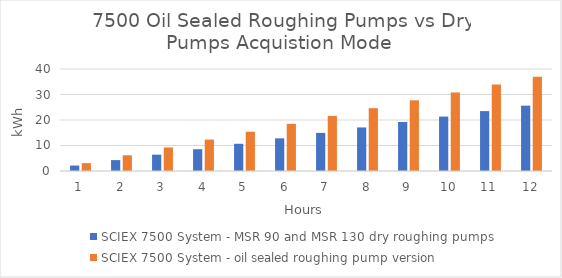
| Category | SCIEX 7500 System - MSR 90 and MSR 130 dry roughing pumps  | SCIEX 7500 System - oil sealed roughing pump version  |
|---|---|---|
| 0 | 2.135 | 3.08 |
| 1 | 4.27 | 6.16 |
| 2 | 6.405 | 9.24 |
| 3 | 8.54 | 12.32 |
| 4 | 10.675 | 15.4 |
| 5 | 12.81 | 18.48 |
| 6 | 14.945 | 21.56 |
| 7 | 17.08 | 24.64 |
| 8 | 19.215 | 27.72 |
| 9 | 21.35 | 30.8 |
| 10 | 23.485 | 33.88 |
| 11 | 25.62 | 36.96 |